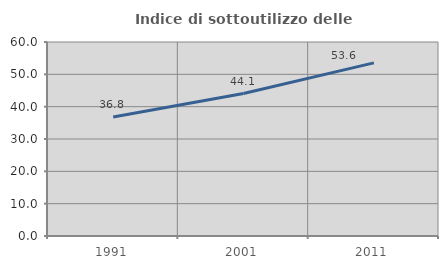
| Category | Indice di sottoutilizzo delle abitazioni  |
|---|---|
| 1991.0 | 36.812 |
| 2001.0 | 44.061 |
| 2011.0 | 53.551 |